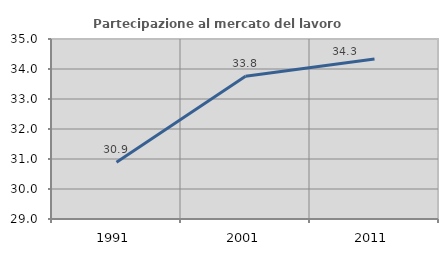
| Category | Partecipazione al mercato del lavoro  femminile |
|---|---|
| 1991.0 | 30.894 |
| 2001.0 | 33.762 |
| 2011.0 | 34.337 |